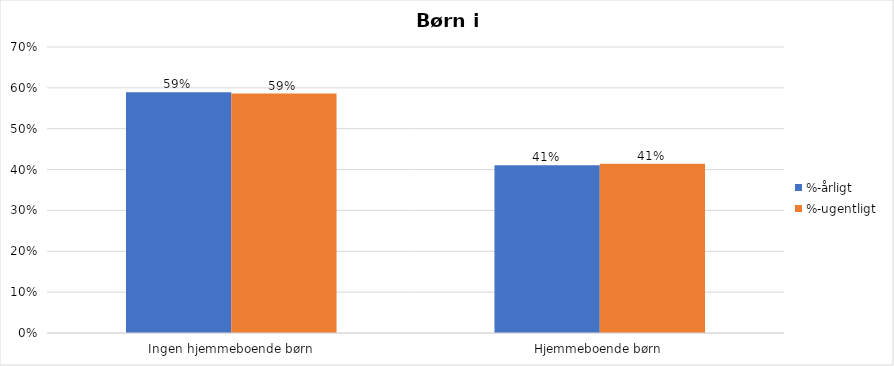
| Category | %-årligt | %-ugentligt |
|---|---|---|
| Ingen hjemmeboende børn | 0.589 | 0.586 |
| Hjemmeboende børn | 0.411 | 0.414 |